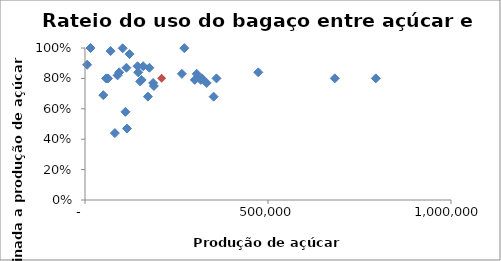
| Category | % de energia do bagaço para açúcar |
|---|---|
| 70006.65 | 0.98 |
| 186093.0 | 0.77 |
| 319615.0 | 0.8 |
| 359096.55 | 0.8 |
| 143551.0 | 0.88 |
| 114752.0 | 0.47 |
| 171877.0 | 0.68 |
| 264721.0 | 0.83 |
| 188278.0 | 0.75 |
| 316300.0 | 0.79 |
| 682500.0 | 0.8 |
| 271424.0 | 0.999 |
| 15000.0 | 1 |
| 110416.5 | 0.58 |
| 102893.0 | 0.998 |
| 81621.0 | 0.44 |
| 50000.0 | 0.69 |
| 332500.0 | 0.77 |
| 63000.0 | 0.8 |
| 150820.61 | 0.78 |
| 473527.0 | 0.84 |
| 5852.17 | 0.89 |
| 351434.0 | 0.68 |
| 154544.0 | 0.79 |
| 93442.0 | 0.84 |
| 159076.0 | 0.88 |
| 175898.0 | 0.87 |
| 113212.0 | 0.87 |
| 121590.0 | 0.96 |
| 89000.0 | 0.82 |
| 300000.0 | 0.79 |
| 794644.0 | 0.8 |
| 57750.0 | 0.8 |
| 305311.0 | 0.83 |
| 145381.9 | 0.84 |
| 209575.06800000003 | 0.801 |